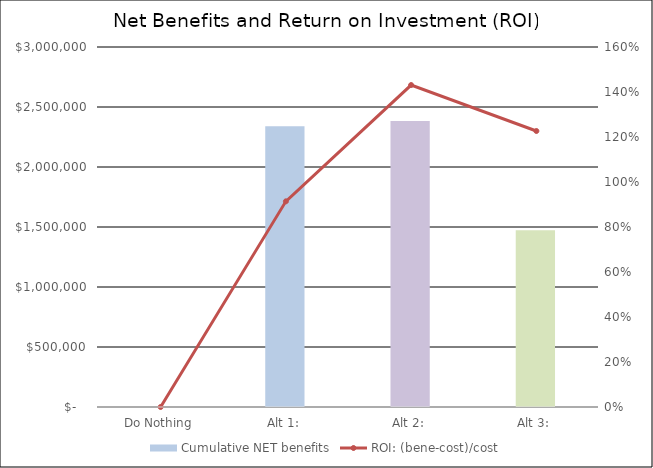
| Category | Cumulative NET benefits |
|---|---|
|  Do Nothing  | 0 |
|  Alt 1:  | 2340000 |
|  Alt 2:  | 2384000 |
|  Alt 3:  | 1472000 |